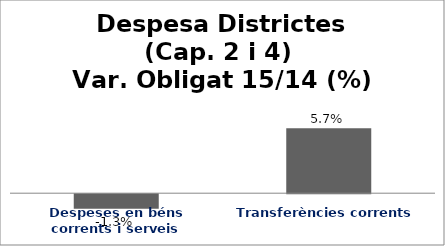
| Category | Series 0 |
|---|---|
| Despeses en béns corrents i serveis | -0.013 |
| Transferències corrents | 0.057 |